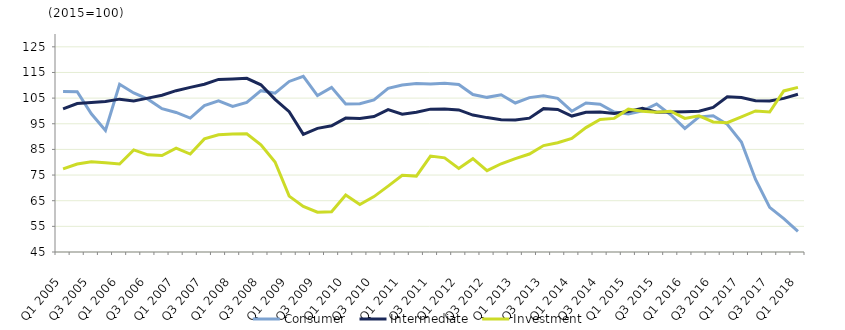
| Category | Consumer | Intermediate | Investment |
|---|---|---|---|
| Q1 2005 | 107.6 | 100.8 | 77.4 |
|  | 107.5 | 102.9 | 79.3 |
| Q3 2005 | 98.9 | 103.3 | 80.2 |
|  | 92.4 | 103.7 | 79.8 |
| Q1 2006 | 110.4 | 104.6 | 79.3 |
|  | 107 | 103.9 | 84.8 |
| Q3 2006 | 104.6 | 105 | 82.9 |
|  | 100.9 | 106.1 | 82.6 |
| Q1 2007 | 99.4 | 107.9 | 85.5 |
|  | 97.2 | 109.2 | 83.2 |
| Q3 2007 | 102.1 | 110.4 | 89.1 |
|  | 103.9 | 112.3 | 90.7 |
| Q1 2008 | 101.8 | 112.5 | 91 |
|  | 103.3 | 112.7 | 91.1 |
| Q3 2008 | 107.9 | 110.2 | 86.8 |
|  | 106.9 | 104.5 | 80.1 |
| Q1 2009 | 111.5 | 99.7 | 66.8 |
|  | 113.5 | 90.9 | 62.8 |
| Q3 2009 | 106 | 93.2 | 60.5 |
|  | 109.2 | 94.2 | 60.7 |
| Q1 2010 | 102.7 | 97.2 | 67.2 |
|  | 102.8 | 97.1 | 63.5 |
| Q3 2010 | 104.3 | 97.8 | 66.6 |
|  | 108.8 | 100.5 | 70.7 |
| Q1 2011 | 110.1 | 98.7 | 74.9 |
|  | 110.7 | 99.5 | 74.6 |
| Q3 2011 | 110.5 | 100.7 | 82.4 |
|  | 110.8 | 100.8 | 81.7 |
| Q1 2012 | 110.3 | 100.4 | 77.6 |
|  | 106.4 | 98.4 | 81.4 |
| Q3 2012 | 105.3 | 97.4 | 76.7 |
|  | 106.3 | 96.6 | 79.4 |
| Q1 2013 | 103.1 | 96.5 | 81.4 |
|  | 105.2 | 97.2 | 83.2 |
| Q3 2013 | 105.9 | 100.9 | 86.5 |
|  | 104.9 | 100.6 | 87.6 |
| Q1 2014 | 99.9 | 98 | 89.3 |
|  | 103.1 | 99.5 | 93.5 |
| Q3 2014 | 102.6 | 99.6 | 96.7 |
|  | 99.6 | 99 | 97.1 |
| Q1 2015 | 98.8 | 99.8 | 100.7 |
|  | 100 | 101 | 99.9 |
| Q3 2015 | 102.7 | 99.5 | 99.5 |
|  | 98.5 | 99.6 | 99.9 |
| Q1 2016 | 93.2 | 99.7 | 97.1 |
|  | 97.7 | 99.9 | 98.1 |
| Q3 2016 | 98.1 | 101.4 | 95.7 |
|  | 94.8 | 105.5 | 95.4 |
| Q1 2017 | 87.9 | 105.2 | 97.7 |
|  | 73.3 | 104 | 100 |
| Q3 2017 | 62.4 | 103.9 | 99.6 |
|  | 58 | 104.9 | 107.8 |
| Q1 2018 | 53 | 106.5 | 109.2 |